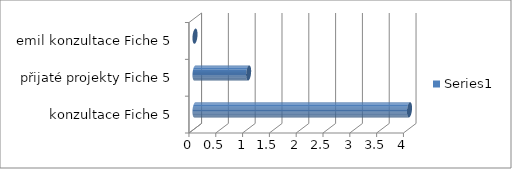
| Category | Series 0 |
|---|---|
|  konzultace Fiche 5 | 4 |
| přijaté projekty Fiche 5 | 1 |
| emil konzultace Fiche 5 | 0 |